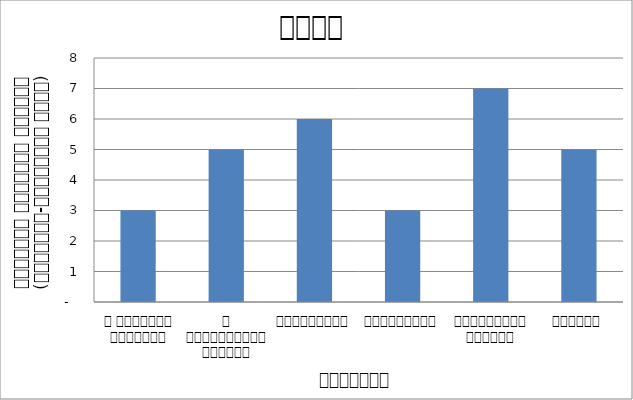
| Category | समाज |
|---|---|
| द हिमालयन टाइम्स् | 3 |
| द काठमाण्डौं पोस्ट् | 5 |
| रिपब्लिका | 6 |
| कान्तिपुर | 3 |
| अन्नपूर्ण पोस्ट् | 7 |
| नागरिक | 5 |